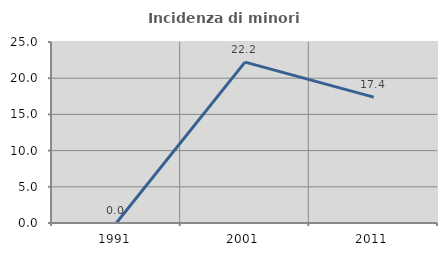
| Category | Incidenza di minori stranieri |
|---|---|
| 1991.0 | 0 |
| 2001.0 | 22.222 |
| 2011.0 | 17.391 |